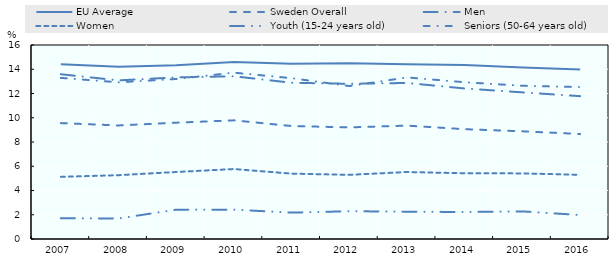
| Category | EU Average | Sweden Overall | Men | Women | Youth (15-24 years old) | Seniors (50-64 years old) |
|---|---|---|---|---|---|---|
| 2007.0 | 14.419 | 9.559 | 13.589 | 5.126 | 1.714 | 13.287 |
| 2008.0 | 14.216 | 9.364 | 13.082 | 5.264 | 1.692 | 12.923 |
| 2009.0 | 14.333 | 9.594 | 13.328 | 5.526 | 2.421 | 13.196 |
| 2010.0 | 14.595 | 9.786 | 13.42 | 5.771 | 2.42 | 13.718 |
| 2011.0 | 14.446 | 9.317 | 12.886 | 5.39 | 2.175 | 13.262 |
| 2012.0 | 14.502 | 9.205 | 12.8 | 5.292 | 2.291 | 12.616 |
| 2013.0 | 14.418 | 9.352 | 12.868 | 5.525 | 2.253 | 13.324 |
| 2014.0 | 14.354 | 9.057 | 12.414 | 5.42 | 2.226 | 12.927 |
| 2015.0 | 14.148 | 8.88 | 12.092 | 5.41 | 2.278 | 12.637 |
| 2016.0 | 13.986 | 8.662 | 11.781 | 5.294 | 1.978 | 12.529 |